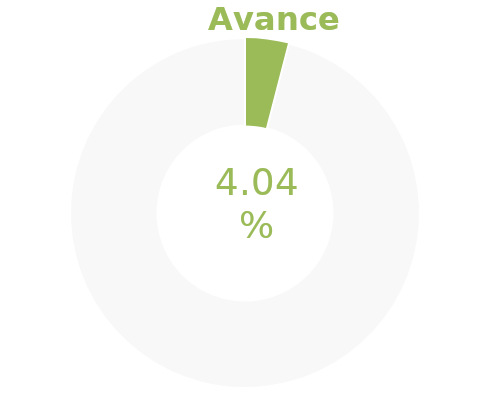
| Category | Series 0 |
|---|---|
| Acumulado 1 Trimestre | 0.04 |
| Año | -0.96 |